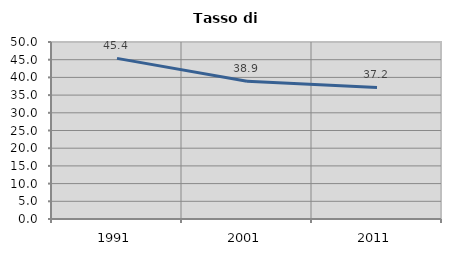
| Category | Tasso di disoccupazione   |
|---|---|
| 1991.0 | 45.378 |
| 2001.0 | 38.89 |
| 2011.0 | 37.175 |